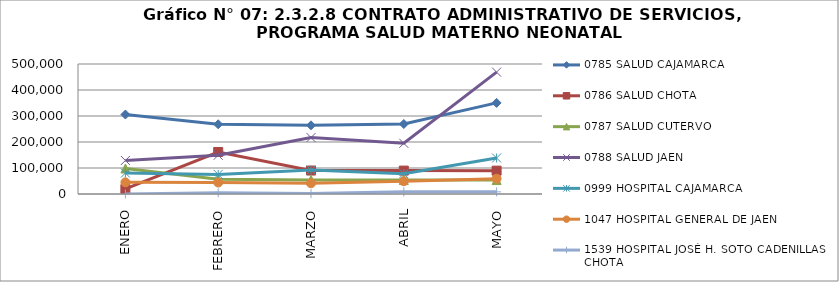
| Category | 0785 SALUD CAJAMARCA | 0786 SALUD CHOTA | 0787 SALUD CUTERVO | 0788 SALUD JAEN | 0999 HOSPITAL CAJAMARCA | 1047 HOSPITAL GENERAL DE JAEN | 1539 HOSPITAL JOSÉ H. SOTO CADENILLAS - CHOTA |
|---|---|---|---|---|---|---|---|
| ENERO | 305661 | 19359 | 98062 | 128989 | 80602 | 44718 | 0 |
| FEBRERO | 268152 | 161605 | 57073 | 149094 | 75255 | 44190 | 4704 |
| MARZO | 264160 | 90205 | 54222 | 217050 | 92028 | 41290 | 1704 |
| ABRIL | 269147 | 89969 | 53847 | 194996 | 78253 | 49186 | 8224 |
| MAYO | 350423 | 89792 | 53662 | 468807 | 138456 | 59003 | 8225 |